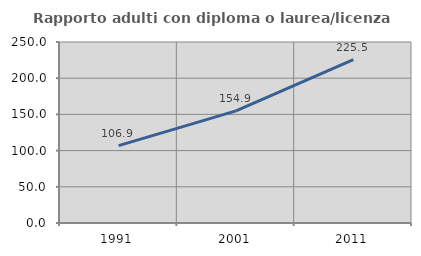
| Category | Rapporto adulti con diploma o laurea/licenza media  |
|---|---|
| 1991.0 | 106.908 |
| 2001.0 | 154.933 |
| 2011.0 | 225.487 |